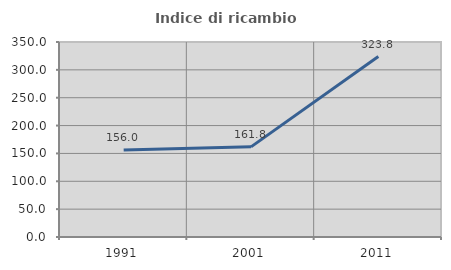
| Category | Indice di ricambio occupazionale  |
|---|---|
| 1991.0 | 156 |
| 2001.0 | 161.765 |
| 2011.0 | 323.81 |